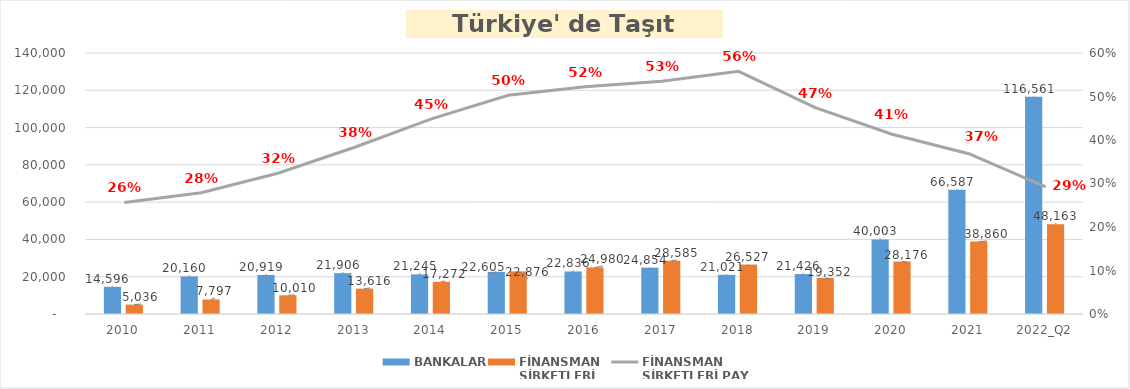
| Category | BANKALAR | FİNANSMAN 
ŞİRKETLERİ |
|---|---|---|
| 2010 | 14595.746 | 5035.89 |
| 2011 | 20160.143 | 7796.854 |
| 2012 | 20919.143 | 10009.755 |
| 2013 | 21905.99 | 13616.036 |
| 2014 | 21244.953 | 17271.844 |
| 2015 | 22605.033 | 22875.563 |
| 2016 | 22835.961 | 24980.231 |
| 2017 | 24853.571 | 28584.938 |
| 2018 | 21021.01 | 26527.133 |
| 2019 | 21426.278 | 19352.327 |
| 2020 | 40002.964 | 28176.3 |
| 2021 | 66586.576 | 38860.099 |
| 2022_Q2 | 116561.054 | 48163.078 |